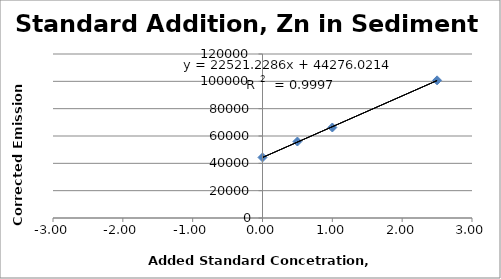
| Category | Series 0 |
|---|---|
| 0.0 | 44295.4 |
| 0.5 | 55944.9 |
| 1.0 | 66220.6 |
| 2.5 | 100728.1 |